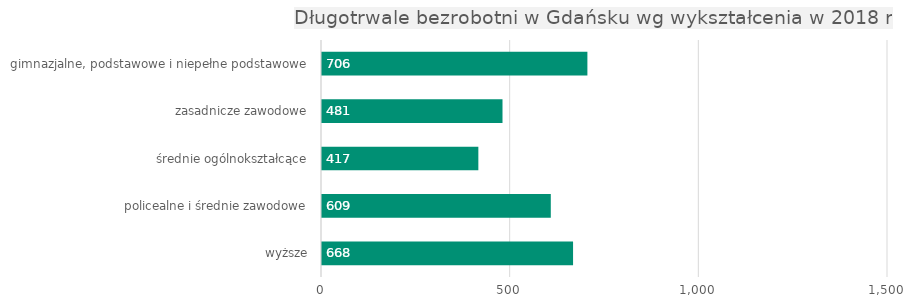
| Category | Series 0 |
|---|---|
| wyższe | 668 |
| policealne i średnie zawodowe | 609 |
| średnie ogólnokształcące | 417 |
| zasadnicze zawodowe | 481 |
| gimnazjalne, podstawowe i niepełne podstawowe | 706 |